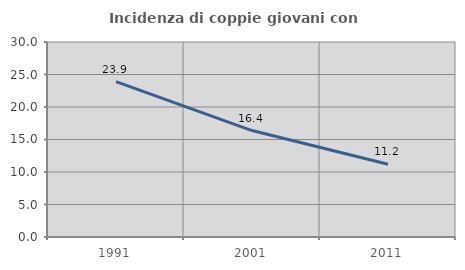
| Category | Incidenza di coppie giovani con figli |
|---|---|
| 1991.0 | 23.911 |
| 2001.0 | 16.379 |
| 2011.0 | 11.192 |